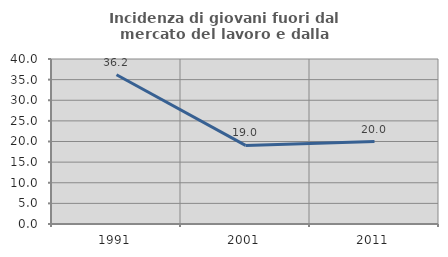
| Category | Incidenza di giovani fuori dal mercato del lavoro e dalla formazione  |
|---|---|
| 1991.0 | 36.17 |
| 2001.0 | 19.048 |
| 2011.0 | 20 |